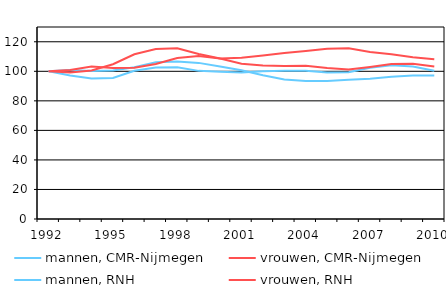
| Category | mannen, CMR-Nijmegen | vrouwen, CMR-Nijmegen | mannen, RNH | vrouwen, RNH |
|---|---|---|---|---|
| 1992.0 | 100 | 100 | 100 | 100 |
| 1993.0 | 100.96 | 100.886 | 97.093 | 99.248 |
| 1994.0 | 100.224 | 103.203 | 95.166 | 100.579 |
| 1995.0 | 100.478 | 102.196 | 95.431 | 104.76 |
| 1996.0 | 102.753 | 102.394 | 100.356 | 111.529 |
| 1997.0 | 106.099 | 104.91 | 102.62 | 115.031 |
| 1998.0 | 106.564 | 109.019 | 102.795 | 115.604 |
| 1999.0 | 105.703 | 110.294 | 100.3 | 111.69 |
| 2000.0 | 103.224 | 108.662 | 99.646 | 108.64 |
| 2001.0 | 100.661 | 109.129 | 99.13 | 105.081 |
| 2002.0 | 97.384 | 110.776 | 99.981 | 103.938 |
| 2003.0 | 94.525 | 112.419 | 100.46 | 103.656 |
| 2004.0 | 93.375 | 113.784 | 100.404 | 103.79 |
| 2005.0 | 93.414 | 115.255 | 99.246 | 102.247 |
| 2006.0 | 94.352 | 115.537 | 99.385 | 101.172 |
| 2007.0 | 95.03 | 113.042 | 102.434 | 102.979 |
| 2008.0 | 96.342 | 111.48 | 104.1 | 104.889 |
| 2009.0 | 97.179 | 109.553 | 103.181 | 105.037 |
| 2010.0 | 97.115 | 108.138 | 100.401 | 103.212 |